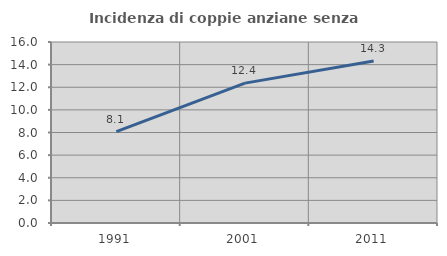
| Category | Incidenza di coppie anziane senza figli  |
|---|---|
| 1991.0 | 8.085 |
| 2001.0 | 12.363 |
| 2011.0 | 14.326 |